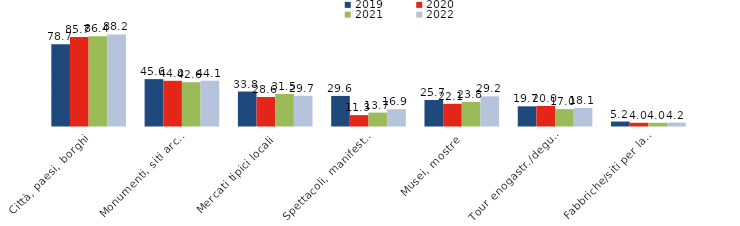
| Category | 2019 | 2020 | 2021 | 2022 |
|---|---|---|---|---|
| Città, paesi, borghi | 78.7 | 85.7 | 86.4 | 88.2 |
| Monumenti, siti archeologici | 45.6 | 44 | 42.6 | 44.1 |
| Mercati tipici locali | 33.8 | 28.6 | 31.5 | 29.7 |
| Spettacoli, manifestazioni | 29.6 | 11.3 | 13.7 | 16.9 |
| Musei, mostre | 25.7 | 22.1 | 23.8 | 29.2 |
| Tour enogastr./degustazioni | 19.7 | 20 | 17 | 18.1 |
| Fabbriche/siti per la produz.di beni  | 5.2 | 4 | 4 | 4.2 |